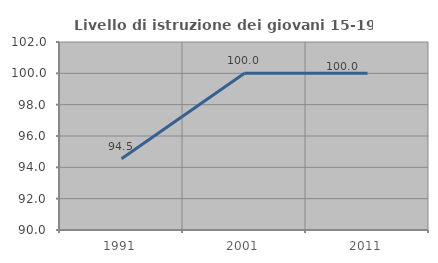
| Category | Livello di istruzione dei giovani 15-19 anni |
|---|---|
| 1991.0 | 94.545 |
| 2001.0 | 100 |
| 2011.0 | 100 |